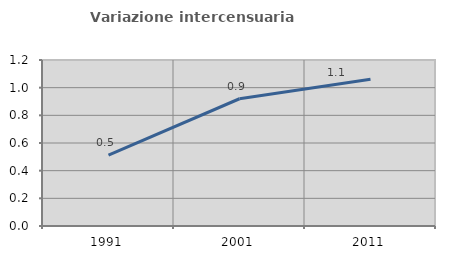
| Category | Variazione intercensuaria annua |
|---|---|
| 1991.0 | 0.512 |
| 2001.0 | 0.92 |
| 2011.0 | 1.061 |